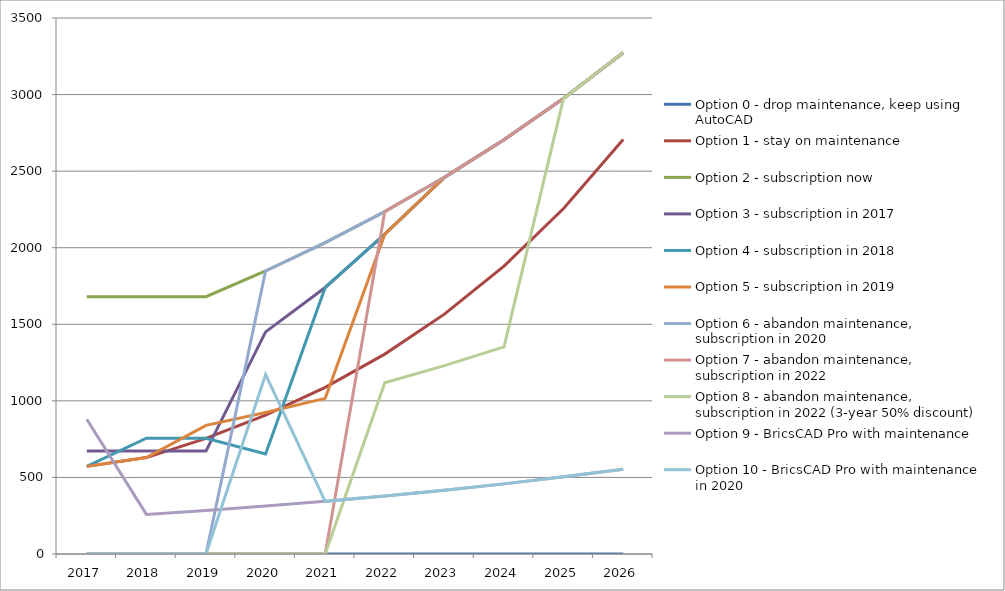
| Category | Option 0 - drop maintenance, keep using AutoCAD | Option 1 - stay on maintenance | Option 2 - subscription now | Option 3 - subscription in 2017 | Option 4 - subscription in 2018 | Option 5 - subscription in 2019 | Option 6 - abandon maintenance, subscription in 2020 | Option 7 - abandon maintenance, subscription in 2022 | Option 8 - abandon maintenance, subscription in 2022 (3-year 50% discount) | Option 9 - BricsCAD Pro with maintenance | Option 10 - BricsCAD Pro with maintenance in 2020 |
|---|---|---|---|---|---|---|---|---|---|---|---|
| 2017.0 | 0 | 572.25 | 1680 | 672 | 572.25 | 572.25 | 0 | 0 | 0 | 880 | 0 |
| 2018.0 | 0 | 629.475 | 1680 | 672 | 756 | 629.475 | 0 | 0 | 0 | 258.5 | 0 |
| 2019.0 | 0 | 755.37 | 1680 | 672 | 756 | 840 | 0 | 0 | 0 | 284.35 | 0 |
| 2020.0 | 0 | 906.444 | 1848 | 1450.31 | 652.64 | 924 | 1848 | 0 | 0 | 312.785 | 1171.28 |
| 2021.0 | 0 | 1087.733 | 2032.8 | 1740.372 | 1740.372 | 1016.4 | 2032.8 | 0 | 0 | 344.064 | 344.064 |
| 2022.0 | 0 | 1305.279 | 2236.08 | 2088.447 | 2088.447 | 2088.447 | 2236.08 | 2236.08 | 1118.04 | 378.47 | 378.47 |
| 2023.0 | 0 | 1566.335 | 2459.688 | 2458.688 | 2458.688 | 2458.688 | 2459.688 | 2459.688 | 1229.844 | 416.317 | 416.317 |
| 2024.0 | 0 | 1879.602 | 2705.657 | 2704.657 | 2704.657 | 2704.657 | 2705.657 | 2705.657 | 1352.828 | 457.949 | 457.949 |
| 2025.0 | 0 | 2255.523 | 2976.222 | 2975.222 | 2975.222 | 2975.222 | 2976.222 | 2976.222 | 2976.222 | 503.743 | 503.743 |
| 2026.0 | 0 | 2706.627 | 3273.845 | 3272.845 | 3272.845 | 3272.845 | 3273.845 | 3273.845 | 3273.845 | 554.118 | 554.118 |